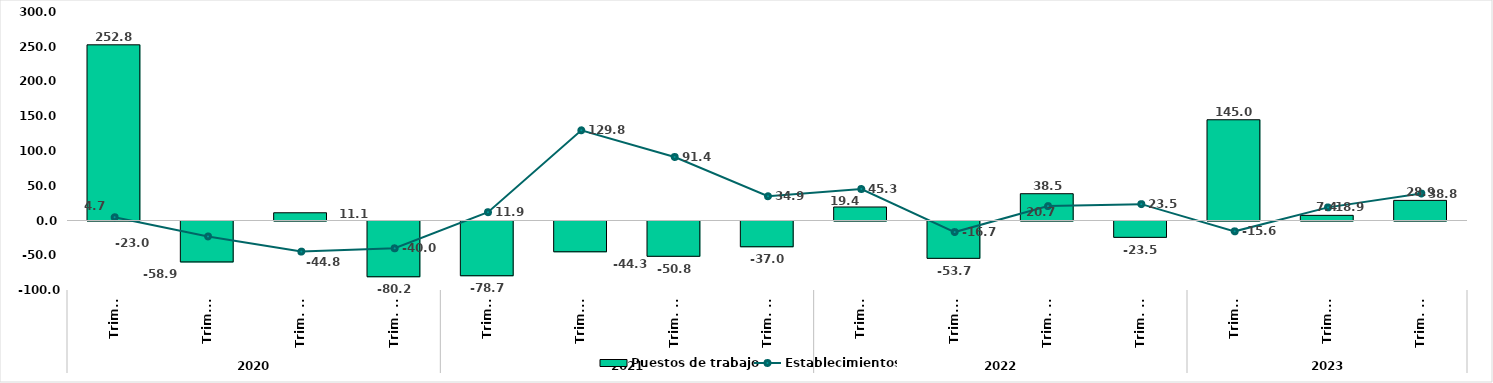
| Category | Puestos de trabajo |
|---|---|
| 0 | 252.778 |
| 1 | -58.901 |
| 2 | 11.111 |
| 3 | -80.196 |
| 4 | -78.74 |
| 5 | -44.268 |
| 6 | -50.769 |
| 7 | -37.037 |
| 8 | 19.444 |
| 9 | -53.714 |
| 10 | 38.542 |
| 11 | -23.529 |
| 12 | 144.961 |
| 13 | 7.407 |
| 14 | 28.947 |